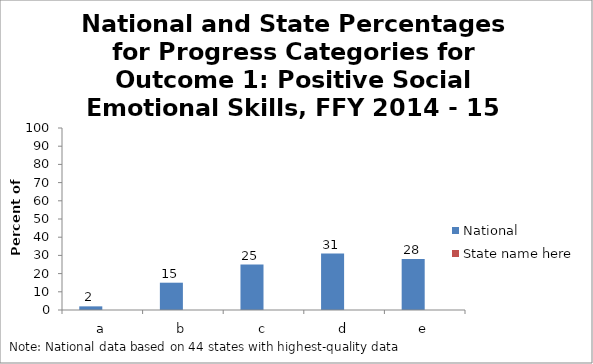
| Category | National | State name here |
|---|---|---|
| a | 2 |  |
| b | 15 |  |
| c | 25 |  |
| d | 31 |  |
| e | 28 |  |